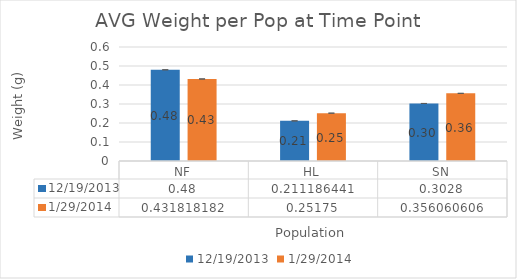
| Category | 12/19/2013 | 1/29/2014 |
|---|---|---|
| NF | 0.48 | 0.432 |
| HL | 0.211 | 0.252 |
| SN | 0.303 | 0.356 |